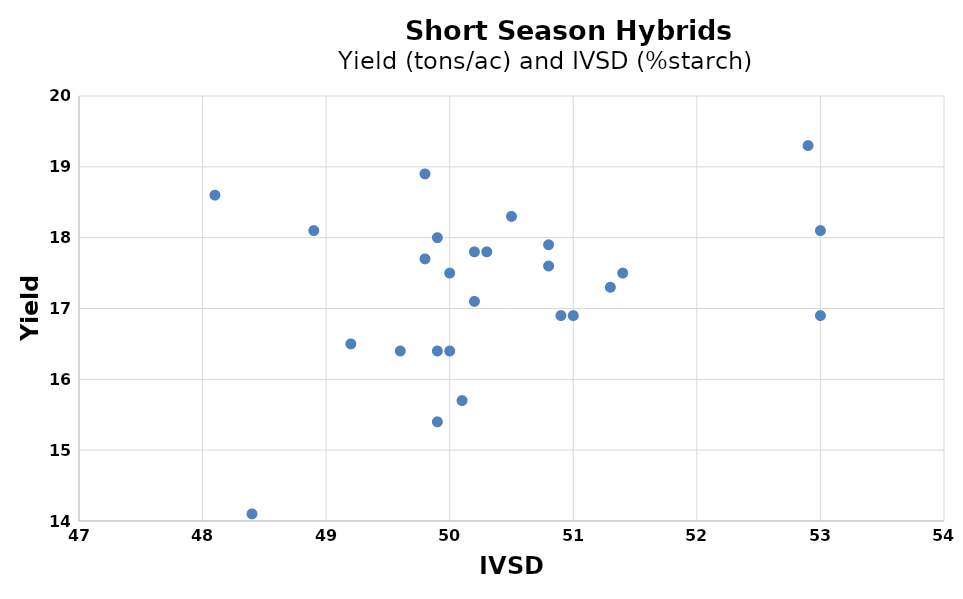
| Category | Series 0 |
|---|---|
| 48.4 | 14.1 |
| 50.8 | 17.9 |
| 52.9 | 19.3 |
| 51.4 | 17.5 |
| 49.2 | 16.5 |
| 50.8 | 17.6 |
| 51.3 | 17.3 |
| 48.1 | 18.6 |
| 51.0 | 16.9 |
| 49.6 | 16.4 |
| 53.0 | 16.9 |
| 49.9 | 18 |
| 48.9 | 18.1 |
| 49.8 | 17.7 |
| 53.0 | 18.1 |
| 50.0 | 17.5 |
| 50.2 | 17.8 |
| 50.0 | 16.4 |
| 50.2 | 17.1 |
| 50.3 | 17.8 |
| 50.1 | 15.7 |
| 49.9 | 16.4 |
| 49.8 | 18.9 |
| 49.9 | 15.4 |
| 50.5 | 18.3 |
| 50.9 | 16.9 |